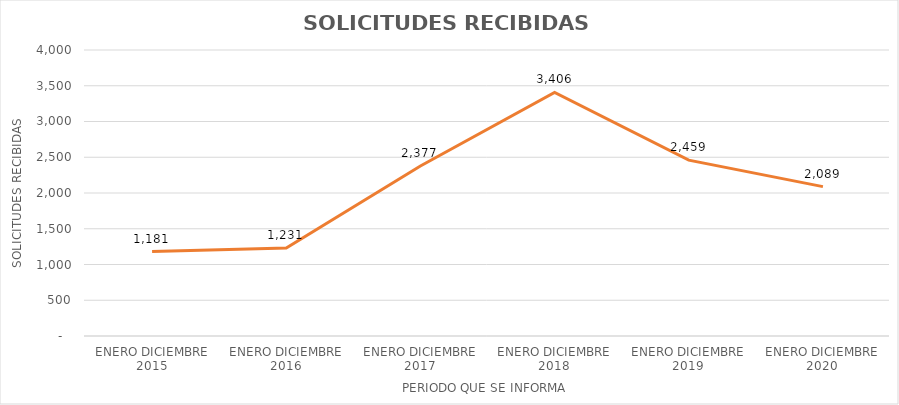
| Category | Series 0 |
|---|---|
| ENERO DICIEMBRE 2015 | 1181 |
| ENERO DICIEMBRE 2016 | 1231 |
| ENERO DICIEMBRE 2017 | 2377 |
| ENERO DICIEMBRE 2018 | 3406 |
| ENERO DICIEMBRE 2019 | 2459 |
| ENERO DICIEMBRE 2020 | 2089 |